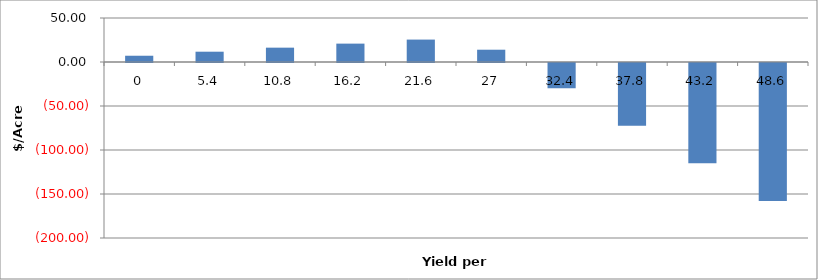
| Category | Series 0 |
|---|---|
| 0.0 | 7.113 |
| 5.4 | 11.703 |
| 10.8 | 16.293 |
| 16.2 | 20.883 |
| 21.6 | 25.473 |
| 27.0 | 13.962 |
| 32.4 | -28.698 |
| 37.8 | -71.358 |
| 43.2 | -114.018 |
| 48.6 | -156.678 |